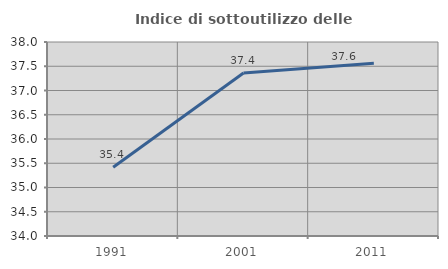
| Category | Indice di sottoutilizzo delle abitazioni  |
|---|---|
| 1991.0 | 35.417 |
| 2001.0 | 37.362 |
| 2011.0 | 37.561 |